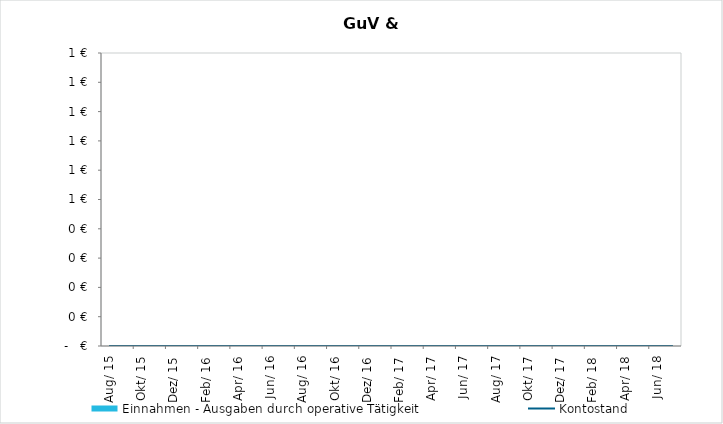
| Category | Einnahmen - Ausgaben durch operative Tätigkeit |
|---|---|
| 2015-08-01 | 0 |
| 2015-09-01 | 0 |
| 2015-10-01 | 0 |
| 2015-11-01 | 0 |
| 2015-12-01 | 0 |
| 2016-01-01 | 0 |
| 2016-02-01 | 0 |
| 2016-03-01 | 0 |
| 2016-04-01 | 0 |
| 2016-05-01 | 0 |
| 2016-06-01 | 0 |
| 2016-07-01 | 0 |
| 2016-08-01 | 0 |
| 2016-09-01 | 0 |
| 2016-10-01 | 0 |
| 2016-11-01 | 0 |
| 2016-12-01 | 0 |
| 2017-01-01 | 0 |
| 2017-02-01 | 0 |
| 2017-03-01 | 0 |
| 2017-04-01 | 0 |
| 2017-05-01 | 0 |
| 2017-06-01 | 0 |
| 2017-07-01 | 0 |
| 2017-08-01 | 0 |
| 2017-09-01 | 0 |
| 2017-10-01 | 0 |
| 2017-11-01 | 0 |
| 2017-12-01 | 0 |
| 2018-01-01 | 0 |
| 2018-02-01 | 0 |
| 2018-03-01 | 0 |
| 2018-04-01 | 0 |
| 2018-05-01 | 0 |
| 2018-06-01 | 0 |
| 2018-07-01 | 0 |